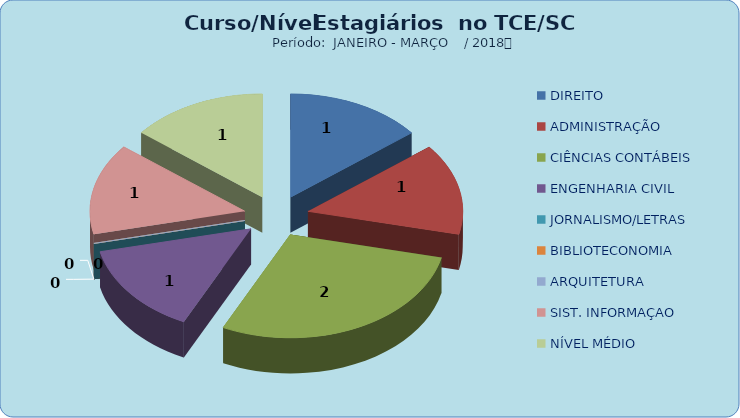
| Category | Series 0 |
|---|---|
| DIREITO | 1 |
| ADMINISTRAÇÃO | 1 |
| CIÊNCIAS CONTÁBEIS | 2 |
| ENGENHARIA CIVIL | 1 |
| JORNALISMO/LETRAS | 0 |
| BIBLIOTECONOMIA | 0 |
| ARQUITETURA | 0 |
| SIST. INFORMAÇAO | 1 |
| NÍVEL MÉDIO | 1 |